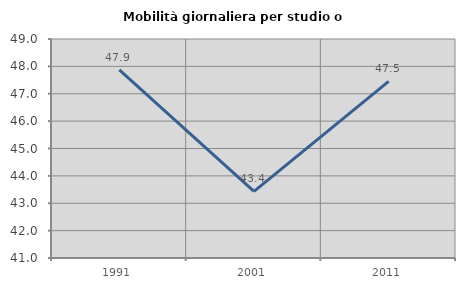
| Category | Mobilità giornaliera per studio o lavoro |
|---|---|
| 1991.0 | 47.87 |
| 2001.0 | 43.432 |
| 2011.0 | 47.45 |